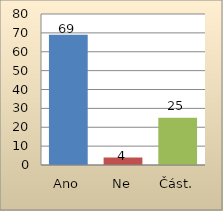
| Category | Series 0 |
|---|---|
| Ano | 69 |
| Ne | 4 |
| Část. | 25 |